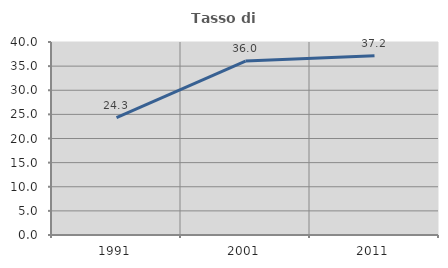
| Category | Tasso di occupazione   |
|---|---|
| 1991.0 | 24.33 |
| 2001.0 | 36.037 |
| 2011.0 | 37.164 |